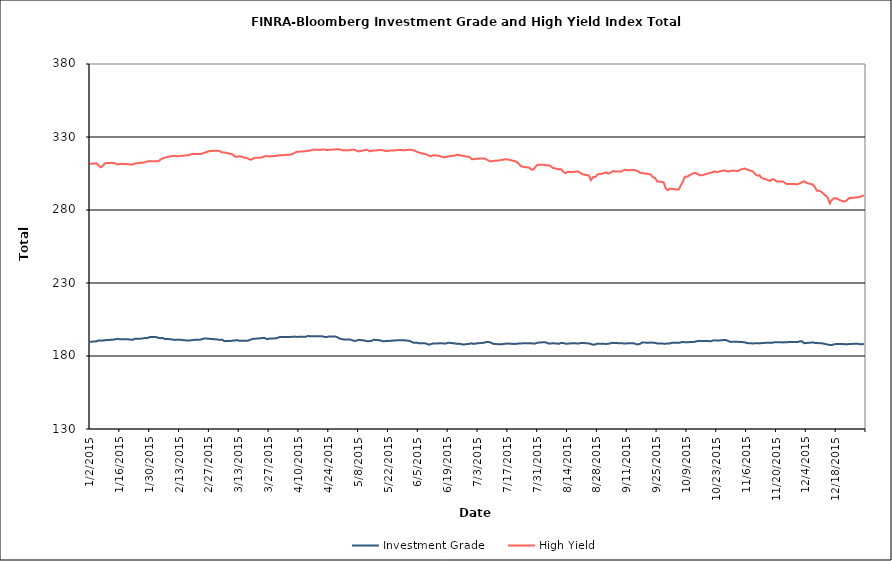
| Category | Investment Grade | High Yield |
|---|---|---|
| 1/2/15 | 189.707 | 311.585 |
| 1/5/15 | 190.061 | 311.981 |
| 1/6/15 | 190.617 | 310.514 |
| 1/7/15 | 190.665 | 309.236 |
| 1/8/15 | 190.51 | 310.323 |
| 1/9/15 | 190.821 | 312.032 |
| 1/12/15 | 191.135 | 312.279 |
| 1/13/15 | 191.197 | 312.116 |
| 1/14/15 | 191.521 | 311.828 |
| 1/15/15 | 191.841 | 311.162 |
| 1/16/15 | 191.445 | 311.605 |
| 1/20/15 | 191.389 | 311.391 |
| 1/21/15 | 191.221 | 311.144 |
| 1/22/15 | 191.103 | 311.199 |
| 1/23/15 | 191.851 | 311.857 |
| 1/26/15 | 191.9 | 312.326 |
| 1/27/15 | 192.1 | 312.417 |
| 1/28/15 | 192.361 | 312.884 |
| 1/29/15 | 192.305 | 313.314 |
| 1/30/15 | 192.95 | 313.305 |
| 2/2/15 | 192.968 | 313.334 |
| 2/3/15 | 192.453 | 313.318 |
| 2/4/15 | 192.202 | 314.525 |
| 2/5/15 | 192.42 | 315.219 |
| 2/6/15 | 191.635 | 315.883 |
| 2/9/15 | 191.513 | 316.843 |
| 2/10/15 | 191.119 | 316.93 |
| 2/11/15 | 191.011 | 317.059 |
| 2/12/15 | 191.228 | 316.766 |
| 2/13/15 | 191.17 | 316.948 |
| 2/17/15 | 190.516 | 317.553 |
| 2/18/15 | 190.732 | 317.925 |
| 2/19/15 | 190.899 | 318.48 |
| 2/20/15 | 191.064 | 318.317 |
| 2/23/15 | 191.233 | 318.426 |
| 2/24/15 | 191.796 | 318.871 |
| 2/25/15 | 192.095 | 319.378 |
| 2/26/15 | 191.89 | 319.888 |
| 2/27/15 | 191.784 | 320.343 |
| 3/2/15 | 191.428 | 320.609 |
| 3/3/15 | 191.217 | 320.621 |
| 3/4/15 | 191.071 | 320.166 |
| 3/5/15 | 191.13 | 319.366 |
| 3/6/15 | 190.188 | 319.372 |
| 3/9/15 | 190.354 | 318.446 |
| 3/10/15 | 190.614 | 317.968 |
| 3/11/15 | 190.601 | 316.558 |
| 3/12/15 | 190.908 | 316.519 |
| 3/13/15 | 190.461 | 316.885 |
| 3/16/15 | 190.47 | 315.689 |
| 3/17/15 | 190.485 | 315.333 |
| 3/18/15 | 191.067 | 314.448 |
| 3/19/15 | 191.54 | 314.742 |
| 3/20/15 | 191.822 | 315.682 |
| 3/23/15 | 192.11 | 315.866 |
| 3/24/15 | 192.44 | 316.214 |
| 3/25/15 | 192.239 | 316.861 |
| 3/26/15 | 191.565 | 316.964 |
| 3/27/15 | 191.862 | 316.677 |
| 3/30/15 | 192.098 | 317.03 |
| 3/31/15 | 192.401 | 317.31 |
| 4/1/15 | 193.098 | 317.42 |
| 4/2/15 | 193.003 | 317.516 |
| 4/6/15 | 193.061 | 317.916 |
| 4/7/15 | 193.189 | 318.403 |
| 4/8/15 | 193.294 | 319.183 |
| 4/9/15 | 193.065 | 319.982 |
| 4/10/15 | 193.121 | 319.944 |
| 4/13/15 | 193.1 | 320.249 |
| 4/14/15 | 193.634 | 320.514 |
| 4/15/15 | 193.607 | 320.559 |
| 4/16/15 | 193.507 | 321.112 |
| 4/17/15 | 193.596 | 321.387 |
| 4/20/15 | 193.52 | 321.137 |
| 4/21/15 | 193.485 | 321.448 |
| 4/22/15 | 193.004 | 321.42 |
| 4/23/15 | 193.028 | 321.095 |
| 4/24/15 | 193.376 | 321.187 |
| 4/27/15 | 193.341 | 321.481 |
| 4/28/15 | 192.898 | 321.656 |
| 4/29/15 | 191.919 | 321.552 |
| 4/30/15 | 191.641 | 321.035 |
| 5/1/15 | 191.347 | 320.923 |
| 5/4/15 | 191.24 | 320.985 |
| 5/5/15 | 190.804 | 321.415 |
| 5/6/15 | 190.311 | 321.24 |
| 5/7/15 | 190.486 | 320.599 |
| 5/8/15 | 191.114 | 320.138 |
| 5/11/15 | 190.518 | 321.066 |
| 5/12/15 | 190.062 | 321.303 |
| 5/13/15 | 190.17 | 320.241 |
| 5/14/15 | 190.341 | 320.532 |
| 5/15/15 | 191.128 | 320.675 |
| 5/18/15 | 190.766 | 321.09 |
| 5/19/15 | 190.19 | 321.013 |
| 5/20/15 | 190.072 | 320.685 |
| 5/21/15 | 190.363 | 320.346 |
| 5/22/15 | 190.34 | 320.591 |
| 5/26/15 | 190.75 | 320.969 |
| 5/27/15 | 190.746 | 321.078 |
| 5/28/15 | 190.768 | 321.085 |
| 5/29/15 | 190.858 | 320.932 |
| 6/1/15 | 190.299 | 321.287 |
| 6/2/15 | 189.535 | 321.112 |
| 6/3/15 | 188.981 | 320.755 |
| 6/4/15 | 189.213 | 320.082 |
| 6/5/15 | 188.734 | 319.441 |
| 6/8/15 | 188.775 | 318.312 |
| 6/9/15 | 188.302 | 317.984 |
| 6/10/15 | 187.769 | 317.115 |
| 6/11/15 | 188.261 | 316.776 |
| 6/12/15 | 188.635 | 317.519 |
| 6/15/15 | 188.648 | 317.054 |
| 6/16/15 | 188.708 | 316.418 |
| 6/17/15 | 188.537 | 316.12 |
| 6/18/15 | 188.609 | 316.3 |
| 6/19/15 | 189.116 | 316.722 |
| 6/22/15 | 188.628 | 317.238 |
| 6/23/15 | 188.3 | 317.811 |
| 6/24/15 | 188.338 | 317.684 |
| 6/25/15 | 188.237 | 317.368 |
| 6/26/15 | 187.822 | 317.021 |
| 6/29/15 | 188.375 | 316.337 |
| 6/30/15 | 188.681 | 314.703 |
| 7/1/15 | 188.274 | 314.864 |
| 7/2/15 | 188.576 | 315.1 |
| 7/6/15 | 189.147 | 315.355 |
| 7/7/15 | 189.675 | 314.576 |
| 7/8/15 | 189.613 | 313.726 |
| 7/9/15 | 189.158 | 313.221 |
| 7/10/15 | 188.346 | 313.623 |
| 7/13/15 | 188.004 | 313.933 |
| 7/14/15 | 188.086 | 314.451 |
| 7/15/15 | 188.263 | 314.425 |
| 7/16/15 | 188.395 | 314.773 |
| 7/17/15 | 188.539 | 314.607 |
| 7/20/15 | 188.252 | 313.541 |
| 7/21/15 | 188.364 | 313.008 |
| 7/22/15 | 188.518 | 311.89 |
| 7/23/15 | 188.582 | 310.158 |
| 7/24/15 | 188.713 | 309.546 |
| 7/27/15 | 188.742 | 309.053 |
| 7/28/15 | 188.674 | 307.675 |
| 7/29/15 | 188.468 | 307.681 |
| 7/30/15 | 188.615 | 309.739 |
| 7/31/15 | 189.136 | 311.038 |
| 8/3/15 | 189.44 | 310.99 |
| 8/4/15 | 189.213 | 310.44 |
| 8/5/15 | 188.525 | 310.662 |
| 8/6/15 | 188.549 | 310.156 |
| 8/7/15 | 188.722 | 308.888 |
| 8/10/15 | 188.414 | 307.831 |
| 8/11/15 | 188.993 | 307.899 |
| 8/12/15 | 188.87 | 306.132 |
| 8/13/15 | 188.469 | 305.253 |
| 8/14/15 | 188.452 | 306.097 |
| 8/17/15 | 188.806 | 306.11 |
| 8/18/15 | 188.592 | 306.314 |
| 8/19/15 | 188.512 | 306.318 |
| 8/20/15 | 188.837 | 305.434 |
| 8/21/15 | 188.933 | 304.431 |
| 8/24/15 | 188.595 | 303.589 |
| 8/25/15 | 188.204 | 300.424 |
| 8/26/15 | 187.67 | 302.606 |
| 8/27/15 | 188.019 | 302.604 |
| 8/28/15 | 188.358 | 304.35 |
| 8/31/15 | 188.367 | 305.18 |
| 9/1/15 | 188.247 | 305.826 |
| 9/2/15 | 188.362 | 304.962 |
| 9/3/15 | 188.653 | 305.418 |
| 9/4/15 | 189.01 | 306.544 |
| 9/8/15 | 188.718 | 306.28 |
| 9/9/15 | 188.655 | 307.036 |
| 9/10/15 | 188.494 | 307.608 |
| 9/11/15 | 188.665 | 307.246 |
| 9/14/15 | 188.69 | 307.363 |
| 9/15/15 | 188.159 | 307.074 |
| 9/16/15 | 187.944 | 306.609 |
| 9/17/15 | 188.34 | 305.521 |
| 9/18/15 | 189.306 | 305.22 |
| 9/21/15 | 189.059 | 304.649 |
| 9/22/15 | 189.258 | 304.37 |
| 9/23/15 | 189.047 | 302.461 |
| 9/24/15 | 189.028 | 301.926 |
| 9/25/15 | 188.577 | 299.581 |
| 9/28/15 | 188.471 | 299.012 |
| 9/29/15 | 188.44 | 295.006 |
| 9/30/15 | 188.623 | 293.54 |
| 10/1/15 | 188.623 | 294.564 |
| 10/2/15 | 189.14 | 294.486 |
| 10/5/15 | 189.025 | 293.886 |
| 10/6/15 | 189.276 | 296.403 |
| 10/7/15 | 189.595 | 299.244 |
| 10/8/15 | 189.43 | 302.748 |
| 10/9/15 | 189.435 | 302.803 |
| 10/12/15 | 189.631 | 305.191 |
| 10/13/15 | 189.828 | 305.396 |
| 10/14/15 | 190.284 | 304.61 |
| 10/15/15 | 190.206 | 303.801 |
| 10/16/15 | 190.278 | 303.775 |
| 10/19/15 | 190.23 | 305.084 |
| 10/20/15 | 190.028 | 305.351 |
| 10/21/15 | 190.51 | 305.83 |
| 10/22/15 | 190.755 | 306.449 |
| 10/23/15 | 190.542 | 305.933 |
| 10/26/15 | 190.885 | 306.998 |
| 10/27/15 | 190.974 | 307.039 |
| 10/28/15 | 190.541 | 306.329 |
| 10/29/15 | 189.77 | 306.511 |
| 10/30/15 | 189.791 | 306.829 |
| 11/2/15 | 189.726 | 306.783 |
| 11/3/15 | 189.6 | 307.628 |
| 11/4/15 | 189.523 | 308.064 |
| 11/5/15 | 189.453 | 308.412 |
| 11/6/15 | 188.847 | 307.838 |
| 11/9/15 | 188.6 | 306.34 |
| 11/10/15 | 188.716 | 304.619 |
| 11/11/15 | 188.833 | 303.578 |
| 11/12/15 | 188.608 | 303.745 |
| 11/13/15 | 188.887 | 301.988 |
| 11/16/15 | 189.089 | 300.485 |
| 11/17/15 | 189.003 | 299.857 |
| 11/18/15 | 189.028 | 301.109 |
| 11/19/15 | 189.435 | 300.852 |
| 11/20/15 | 189.385 | 299.564 |
| 11/23/15 | 189.322 | 299.468 |
| 11/24/15 | 189.411 | 298.54 |
| 11/25/15 | 189.478 | 297.716 |
| 11/27/15 | 189.585 | 297.794 |
| 11/30/15 | 189.558 | 297.664 |
| 12/1/15 | 190.086 | 298.227 |
| 12/2/15 | 189.953 | 299.118 |
| 12/3/15 | 188.758 | 299.72 |
| 12/4/15 | 188.919 | 298.59 |
| 12/7/15 | 189.292 | 297.419 |
| 12/8/15 | 188.972 | 295.635 |
| 12/9/15 | 188.913 | 293.107 |
| 12/10/15 | 188.785 | 293.184 |
| 12/11/15 | 188.792 | 292.429 |
| 12/14/15 | 187.841 | 288.532 |
| 12/15/15 | 187.577 | 284.516 |
| 12/16/15 | 187.538 | 286.934 |
| 12/17/15 | 187.998 | 288.067 |
| 12/18/15 | 188.195 | 288.032 |
| 12/21/15 | 188.295 | 285.949 |
| 12/22/15 | 188.067 | 285.827 |
| 12/23/15 | 188.046 | 286.645 |
| 12/24/15 | 188.194 | 288.156 |
| 12/28/15 | 188.439 | 288.68 |
| 12/29/15 | 188.099 | 288.682 |
| 12/30/15 | 188.072 | 289.708 |
| 12/31/15 | 188.32 | 289.923 |